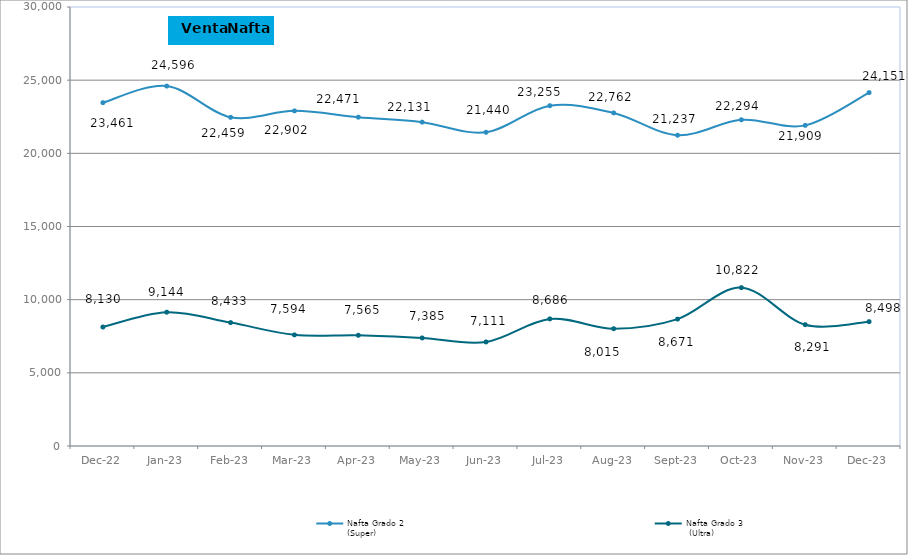
| Category | Nafta Grado 2
(Super) | Nafta Grado 3
 (Ultra)  |
|---|---|---|
| 2022-12-01 | 23461.2 | 8130.34 |
| 2023-01-01 | 24595.956 | 9144.248 |
| 2023-02-01 | 22459.235 | 8433.164 |
| 2023-03-01 | 22902 | 7594.35 |
| 2023-04-01 | 22471.07 | 7565.48 |
| 2023-05-01 | 22131.31 | 7384.99 |
| 2023-06-01 | 21440.4 | 7110.78 |
| 2023-07-01 | 23255.02 | 8686.26 |
| 2023-08-01 | 22761.83 | 8015.38 |
| 2023-09-01 | 21237.28 | 8671.08 |
| 2023-10-01 | 22293.87 | 10821.849 |
| 2023-11-01 | 21909.147 | 8291.063 |
| 2023-12-01 | 24151.455 | 8498.452 |